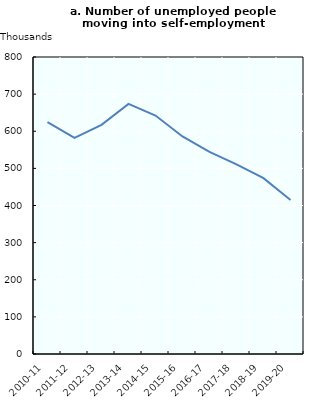
| Category | Number |
|---|---|
| 2010-11 | 624402.678 |
| 2011-12 | 582278.88 |
| 2012-13 | 617090.628 |
| 2013-14 | 673613.73 |
| 2014-15 | 642243.192 |
| 2015-16 | 586064.988 |
| 2016-17 | 544504.208 |
| 2017-18 | 510599.665 |
| 2018-19 | 473762.3 |
| 2019-20 | 414986.68 |